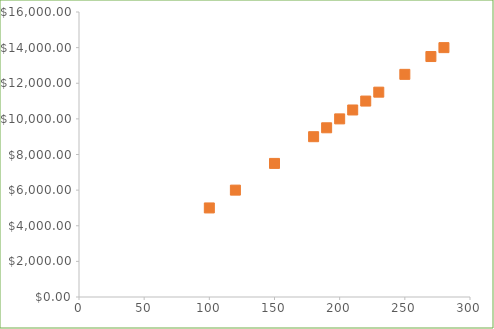
| Category | Revenue (in dollars) |
|---|---|
| 100.0 | 5000 |
| 120.0 | 6000 |
| 150.0 | 7500 |
| 200.0 | 10000 |
| 180.0 | 9000 |
| 220.0 | 11000 |
| 250.0 | 12500 |
| 280.0 | 14000 |
| 230.0 | 11500 |
| 210.0 | 10500 |
| 190.0 | 9500 |
| 270.0 | 13500 |